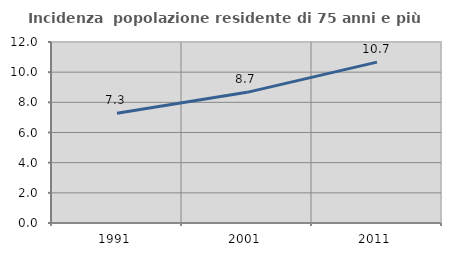
| Category | Incidenza  popolazione residente di 75 anni e più |
|---|---|
| 1991.0 | 7.275 |
| 2001.0 | 8.663 |
| 2011.0 | 10.664 |